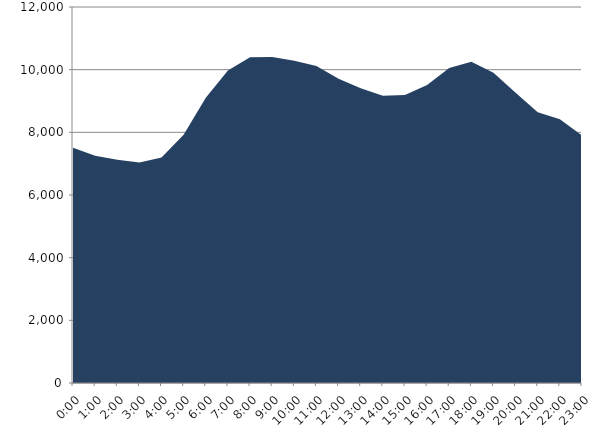
| Category | Series 0 | Series 1 |
|---|---|---|
| 2023-02-15 |  | 7504.419 |
| 2023-02-15 01:00:00 |  | 7250.371 |
| 2023-02-15 02:00:00 |  | 7126.829 |
| 2023-02-15 03:00:00 |  | 7041.11 |
| 2023-02-15 04:00:00 |  | 7195.428 |
| 2023-02-15 05:00:00 |  | 7924.531 |
| 2023-02-15 06:00:00 |  | 9100.261 |
| 2023-02-15 07:00:00 |  | 9975.864 |
| 2023-02-15 08:00:00 |  | 10398.46 |
| 2023-02-15 09:00:00 |  | 10404.953 |
| 2023-02-15 10:00:00 |  | 10287.942 |
| 2023-02-15 11:00:00 |  | 10115.621 |
| 2023-02-15 12:00:00 |  | 9711.977 |
| 2023-02-15 13:00:00 |  | 9407.947 |
| 2023-02-15 14:00:00 |  | 9164.93 |
| 2023-02-15 15:00:00 |  | 9195.302 |
| 2023-02-15 16:00:00 |  | 9509.78 |
| 2023-02-15 17:00:00 |  | 10052.91 |
| 2023-02-15 18:00:00 |  | 10254.394 |
| 2023-02-15 19:00:00 |  | 9901.434 |
| 2023-02-15 20:00:00 |  | 9260.958 |
| 2023-02-15 21:00:00 |  | 8644.109 |
| 2023-02-15 22:00:00 |  | 8417.297 |
| 2023-02-15 23:00:00 |  | 7895.892 |